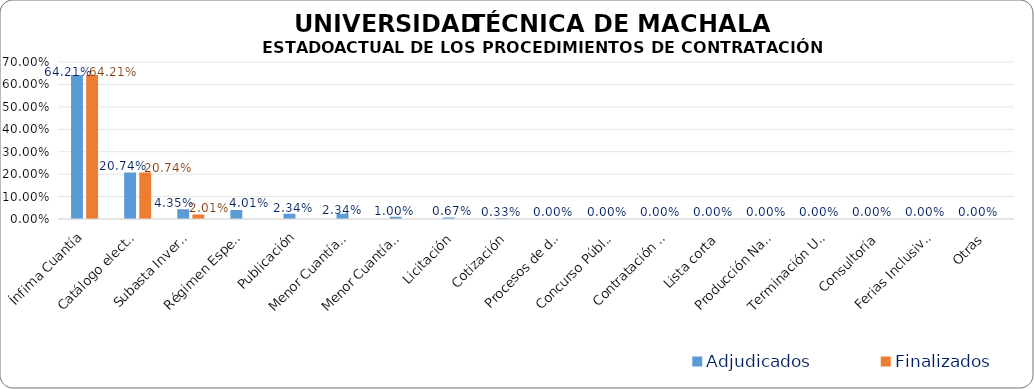
| Category | Adjudicados | Finalizados |
|---|---|---|
| Ínfima Cuantía | 0.642 | 0.642 |
| Catálogo electrónico | 0.207 | 0.207 |
| Subasta Inversa Electrónica | 0.043 | 0.02 |
| Régimen Especial | 0.04 | 0 |
| Publicación | 0.023 | 0 |
| Menor Cuantía Bienes y Servicios | 0.023 | 0 |
| Menor Cuantía Obras | 0.01 | 0 |
| Licitación | 0.007 | 0 |
| Cotización | 0.003 | 0 |
| Procesos de declaratoria de emergencia | 0 | 0 |
| Concurso Público  | 0 | 0 |
| Contratación Directa | 0 | 0 |
| Lista corta | 0 | 0 |
| Producción Nacional | 0 | 0 |
| Terminación Unilateral | 0 | 0 |
| Consultoría | 0 | 0 |
| Ferias Inclusivas | 0 | 0 |
| Otras | 0 | 0 |